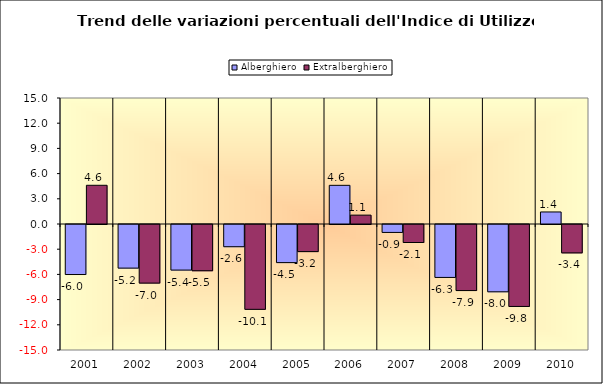
| Category | Alberghiero | Extralberghiero |
|---|---|---|
| 2001.0 | -5.956 | 4.608 |
| 2002.0 | -5.193 | -6.976 |
| 2003.0 | -5.426 | -5.505 |
| 2004.0 | -2.643 | -10.1 |
| 2005.0 | -4.536 | -3.226 |
| 2006.0 | 4.603 | 1.056 |
| 2007.0 | -0.944 | -2.144 |
| 2008.0 | -6.301 | -7.865 |
| 2009.0 | -8.012 | -9.756 |
| 2010.0 | 1.433 | -3.378 |